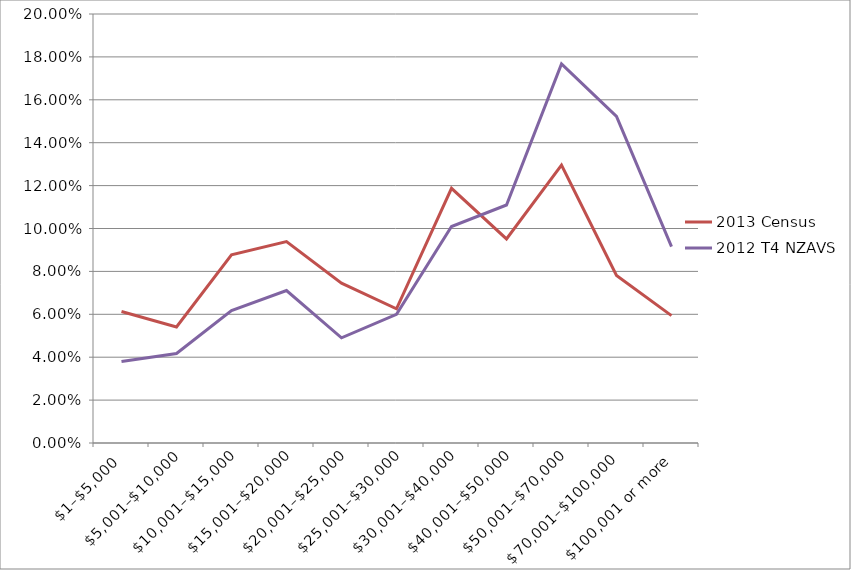
| Category | 2013 Census | 2012 T4 NZAVS |
|---|---|---|
| $1–$5,000 | 0.061 | 0.038 |
| $5,001–$10,000 | 0.054 | 0.042 |
| $10,001–$15,000 | 0.088 | 0.062 |
| $15,001–$20,000 | 0.094 | 0.071 |
| $20,001–$25,000 | 0.074 | 0.049 |
| $25,001–$30,000 | 0.063 | 0.06 |
| $30,001–$40,000 | 0.119 | 0.101 |
| $40,001–$50,000 | 0.095 | 0.111 |
| $50,001–$70,000 | 0.13 | 0.177 |
| $70,001–$100,000 | 0.078 | 0.152 |
| $100,001 or more | 0.059 | 0.092 |